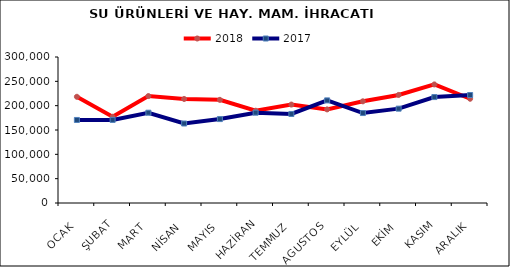
| Category | 2018 | 2017 |
|---|---|---|
| OCAK | 218255.137 | 170613.205 |
| ŞUBAT | 177217.983 | 170754.348 |
| MART | 219741.031 | 185513.326 |
| NİSAN | 213739.284 | 163334.723 |
| MAYIS | 211958.959 | 172427.394 |
| HAZİRAN | 189600.861 | 185578.562 |
| TEMMUZ | 202239.313 | 182961.533 |
| AGUSTOS | 192357.3 | 210840.921 |
| EYLÜL | 208921.235 | 184818.149 |
| EKİM | 222022.943 | 193877.415 |
| KASIM | 243649.408 | 217663.937 |
| ARALIK | 214189.35 | 221901.786 |